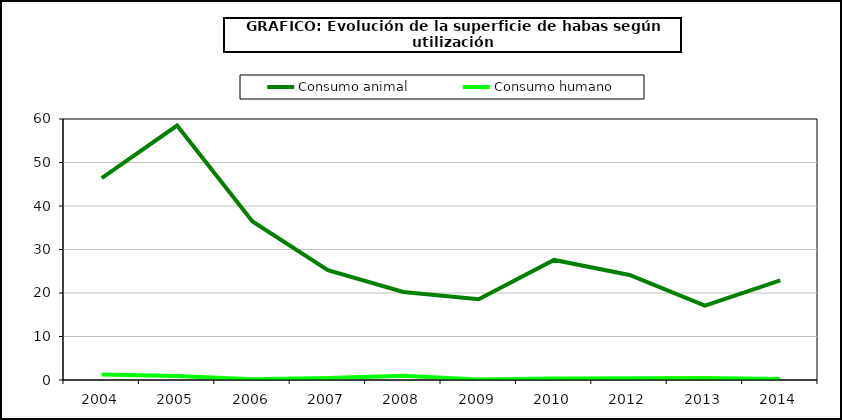
| Category | Consumo animal | Consumo humano |
|---|---|---|
| 2004 | 46.402 | 1.259 |
| 2005 | 58.484 | 0.904 |
| 2006 | 36.441 | 0.162 |
| 2007 | 25.237 | 0.435 |
| 2008 | 20.238 | 0.969 |
| 2009 | 18.586 | 0.118 |
| 2010 | 27.596 | 0.361 |
| 2012 | 24.156 | 0.408 |
| 2013 | 17.1 | 0.442 |
| 2014 | 22.918 | 0.247 |